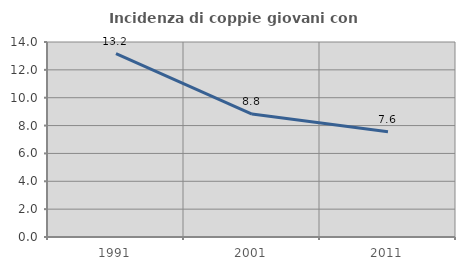
| Category | Incidenza di coppie giovani con figli |
|---|---|
| 1991.0 | 13.174 |
| 2001.0 | 8.824 |
| 2011.0 | 7.558 |